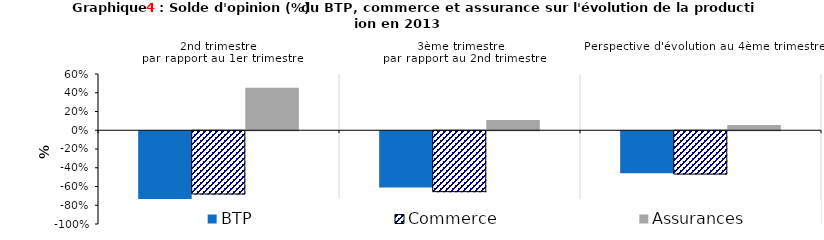
| Category | BTP | Commerce | Assurances |
|---|---|---|---|
| 2nd trimestre 
par rapport au 1er trimestre | -0.755 | -0.674 | 0.453 |
| 3ème trimestre 
par rapport au 2nd trimestre | -0.599 | -0.65 | 0.11 |
| Perspective d'évolution au 4ème trimestre | -0.448 | -0.462 | 0.055 |